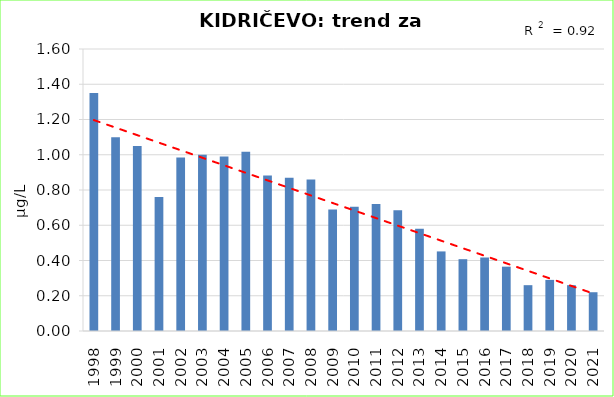
| Category | Vsota |
|---|---|
| 1998 | 1.35 |
| 1999 | 1.1 |
| 2000 | 1.05 |
| 2001 | 0.76 |
| 2002 | 0.985 |
| 2003 | 1 |
| 2004 | 0.99 |
| 2005 | 1.017 |
| 2006 | 0.882 |
| 2007 | 0.87 |
| 2008 | 0.86 |
| 2009 | 0.69 |
| 2010 | 0.705 |
| 2011 | 0.72 |
| 2012 | 0.686 |
| 2013 | 0.58 |
| 2014 | 0.452 |
| 2015 | 0.408 |
| 2016 | 0.417 |
| 2017 | 0.365 |
| 2018 | 0.26 |
| 2019 | 0.29 |
| 2020 | 0.26 |
| 2021 | 0.22 |